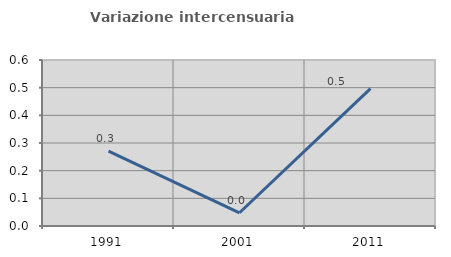
| Category | Variazione intercensuaria annua |
|---|---|
| 1991.0 | 0.27 |
| 2001.0 | 0.048 |
| 2011.0 | 0.496 |